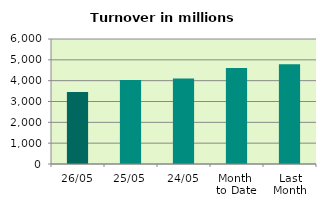
| Category | Series 0 |
|---|---|
| 26/05 | 3461.657 |
| 25/05 | 4029.365 |
| 24/05 | 4099.175 |
| Month 
to Date | 4611.869 |
| Last
Month | 4785.141 |